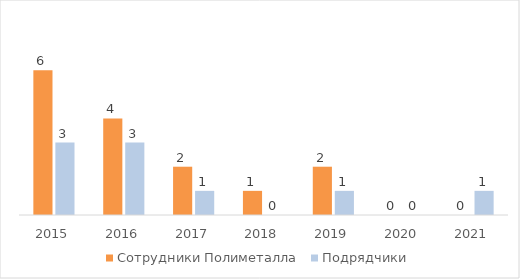
| Category | Сотрудники Полиметалла | Подрядчики |
|---|---|---|
| 2015.0 | 6 | 3 |
| 2016.0 | 4 | 3 |
| 2017.0 | 2 | 1 |
| 2018.0 | 1 | 0 |
| 2019.0 | 2 | 1 |
| 2020.0 | 0 | 0 |
| 2021.0 | 0 | 1 |